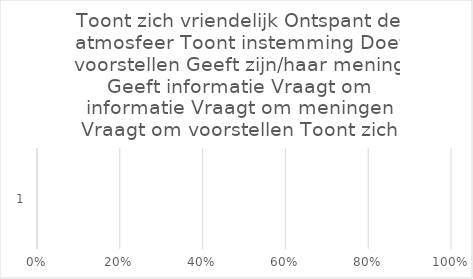
| Category | Toont zich vriendelijk |
|---|---|
| 0 | 0 |